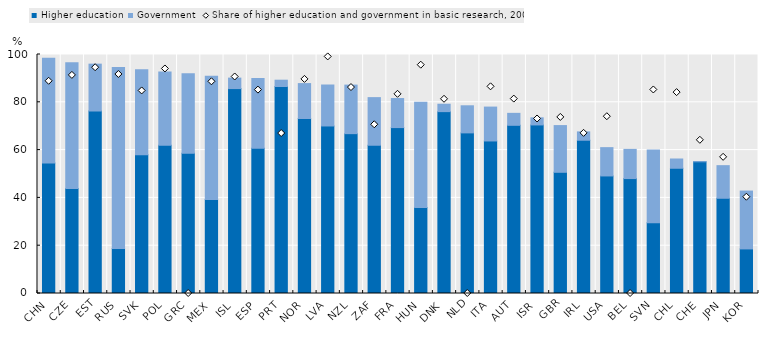
| Category | Higher education | Government |
|---|---|---|
| CHN | 54.604 | 43.805 |
| CZE | 43.9 | 52.676 |
| EST | 76.356 | 19.609 |
| RUS | 18.808 | 75.711 |
| SVK | 58.053 | 35.572 |
| POL | 62.078 | 30.629 |
| GRC | 58.648 | 33.253 |
| MEX | 39.294 | 51.554 |
| ISL | 85.735 | 4.388 |
| ESP | 60.723 | 29.202 |
| PRT | 86.599 | 2.649 |
| NOR | 73.221 | 14.602 |
| LVA | 70.095 | 17.143 |
| NZL | 66.882 | 20.31 |
| ZAF | 62.03 | 19.927 |
| FRA | 69.421 | 12.152 |
| HUN | 35.984 | 44.006 |
| DNK | 76.097 | 3.097 |
| NLD | 67.205 | 11.337 |
| ITA | 63.824 | 14.175 |
| AUT | 70.373 | 5.005 |
| ISR | 70.531 | 2.969 |
| GBR | 50.713 | 19.546 |
| IRL | 64.123 | 3.5 |
| USA | 49.187 | 11.844 |
| BEL | 48.09 | 12.213 |
| SVN | 29.623 | 30.424 |
| CHL | 52.402 | 3.874 |
| CHE | 55.118 | 0.005 |
| JPN | 39.849 | 13.643 |
| KOR | 18.655 | 24.212 |